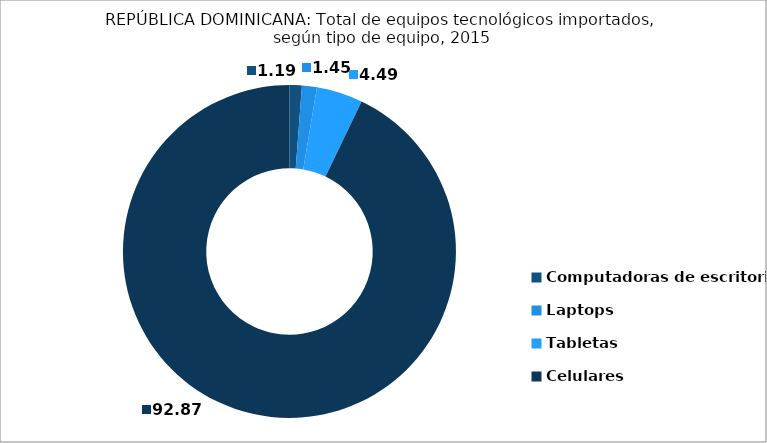
| Category | Series 0 |
|---|---|
| Computadoras de escritorio | 1.191 |
| Laptops | 1.446 |
| Tabletas | 4.49 |
| Celulares | 92.872 |